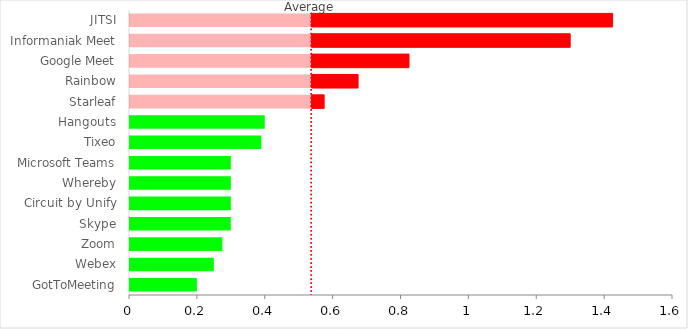
| Category | Basis | >  average | <  average |
|---|---|---|---|
| GotToMeeting | 0 | 0.2 | 0 |
| Webex | 0 | 0.25 | 0 |
| Zoom | 0 | 0.275 | 0 |
| Skype | 0 | 0.3 | 0 |
| Circuit by Unify | 0 | 0.3 | 0 |
| Whereby | 0 | 0.3 | 0 |
| Microsoft Teams | 0 | 0.3 | 0 |
| Tixeo | 0 | 0.39 | 0 |
| Hangouts | 0 | 0.4 | 0 |
| Starleaf | 0.537 | 0 | 0.038 |
| Rainbow | 0.537 | 0 | 0.138 |
| Google Meet | 0.537 | 0 | 0.288 |
| Informaniak Meet | 0.537 | 0 | 0.763 |
| JITSI | 0.537 | 0 | 0.888 |